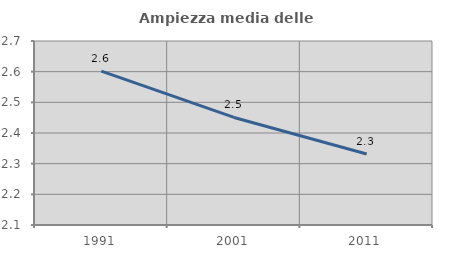
| Category | Ampiezza media delle famiglie |
|---|---|
| 1991.0 | 2.602 |
| 2001.0 | 2.451 |
| 2011.0 | 2.331 |